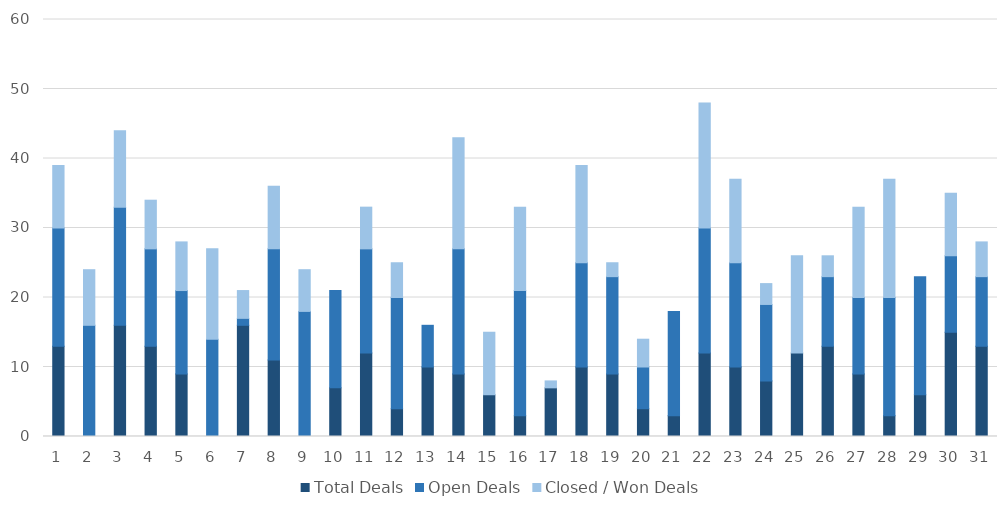
| Category | Total Deals | Open Deals | Closed / Won Deals |
|---|---|---|---|
| 1.0 | 13 | 17 | 9 |
| 2.0 | 0 | 16 | 8 |
| 3.0 | 16 | 17 | 11 |
| 4.0 | 13 | 14 | 7 |
| 5.0 | 9 | 12 | 7 |
| 6.0 | 0 | 14 | 13 |
| 7.0 | 16 | 1 | 4 |
| 8.0 | 11 | 16 | 9 |
| 9.0 | 0 | 18 | 6 |
| 10.0 | 7 | 14 | 0 |
| 11.0 | 12 | 15 | 6 |
| 12.0 | 4 | 16 | 5 |
| 13.0 | 10 | 6 | 0 |
| 14.0 | 9 | 18 | 16 |
| 15.0 | 6 | 0 | 9 |
| 16.0 | 3 | 18 | 12 |
| 17.0 | 7 | 0 | 1 |
| 18.0 | 10 | 15 | 14 |
| 19.0 | 9 | 14 | 2 |
| 20.0 | 4 | 6 | 4 |
| 21.0 | 3 | 15 | 0 |
| 22.0 | 12 | 18 | 18 |
| 23.0 | 10 | 15 | 12 |
| 24.0 | 8 | 11 | 3 |
| 25.0 | 12 | 0 | 14 |
| 26.0 | 13 | 10 | 3 |
| 27.0 | 9 | 11 | 13 |
| 28.0 | 3 | 17 | 17 |
| 29.0 | 6 | 17 | 0 |
| 30.0 | 15 | 11 | 9 |
| 31.0 | 13 | 10 | 5 |